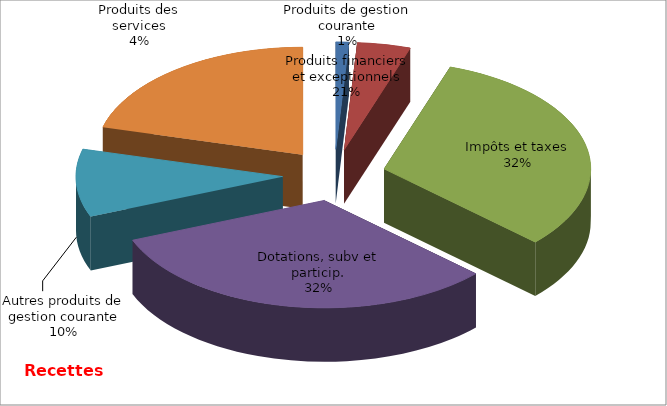
| Category | Series 0 |
|---|---|
| Produits de gestion courante | 18000 |
| Produits des services | 74100 |
| Impôts et taxes | 564252 |
| Dotations, subv et particip. | 568946 |
| Autres produits de gestion courante | 180759.69 |
| Produits financiers et exceptionnels | 371096 |